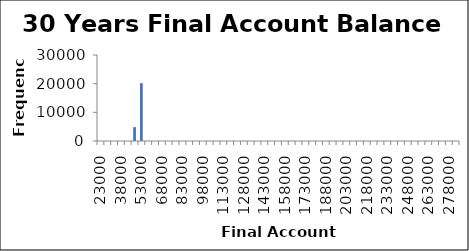
| Category | Frequency |
|---|---|
| 23000.0 | 0 |
| 28000.0 | 0 |
| 33000.0 | 0 |
| 38000.0 | 0 |
| 43000.0 | 0 |
| 48000.0 | 4833 |
| 53000.0 | 20167 |
| 58000.0 | 0 |
| 63000.0 | 0 |
| 68000.0 | 0 |
| 73000.0 | 0 |
| 78000.0 | 0 |
| 83000.0 | 0 |
| 88000.0 | 0 |
| 93000.0 | 0 |
| 98000.0 | 0 |
| 103000.0 | 0 |
| 108000.0 | 0 |
| 113000.0 | 0 |
| 118000.0 | 0 |
| 123000.0 | 0 |
| 128000.0 | 0 |
| 133000.0 | 0 |
| 138000.0 | 0 |
| 143000.0 | 0 |
| 148000.0 | 0 |
| 153000.0 | 0 |
| 158000.0 | 0 |
| 163000.0 | 0 |
| 168000.0 | 0 |
| 173000.0 | 0 |
| 178000.0 | 0 |
| 183000.0 | 0 |
| 188000.0 | 0 |
| 193000.0 | 0 |
| 198000.0 | 0 |
| 203000.0 | 0 |
| 208000.0 | 0 |
| 213000.0 | 0 |
| 218000.0 | 0 |
| 223000.0 | 0 |
| 228000.0 | 0 |
| 233000.0 | 0 |
| 238000.0 | 0 |
| 243000.0 | 0 |
| 248000.0 | 0 |
| 253000.0 | 0 |
| 258000.0 | 0 |
| 263000.0 | 0 |
| 268000.0 | 0 |
| 273000.0 | 0 |
| 278000.0 | 0 |
| More | 0 |